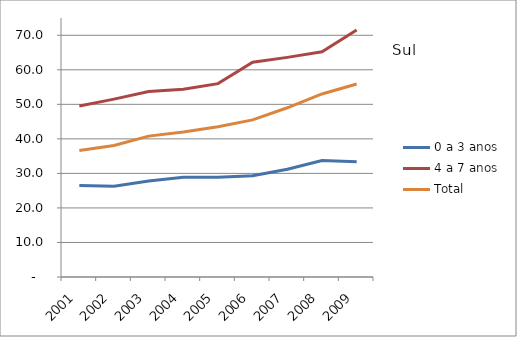
| Category | 0 a 3 anos | 4 a 7 anos | Total |
|---|---|---|---|
| 2001.0 | 26.5 | 49.5 | 36.6 |
| 2002.0 | 26.3 | 51.5 | 38.1 |
| 2003.0 | 27.8 | 53.7 | 40.8 |
| 2004.0 | 28.9 | 54.4 | 42 |
| 2005.0 | 28.9 | 56 | 43.5 |
| 2006.0 | 29.3 | 62.2 | 45.5 |
| 2007.0 | 31.2 | 63.6 | 49 |
| 2008.0 | 33.7 | 65.2 | 53 |
| 2009.0 | 33.4 | 71.5 | 55.9 |